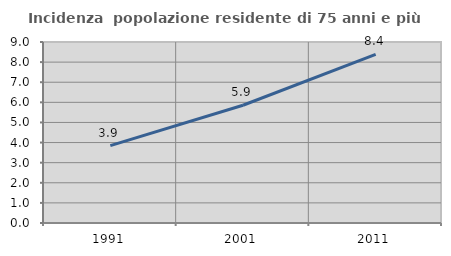
| Category | Incidenza  popolazione residente di 75 anni e più |
|---|---|
| 1991.0 | 3.85 |
| 2001.0 | 5.855 |
| 2011.0 | 8.388 |